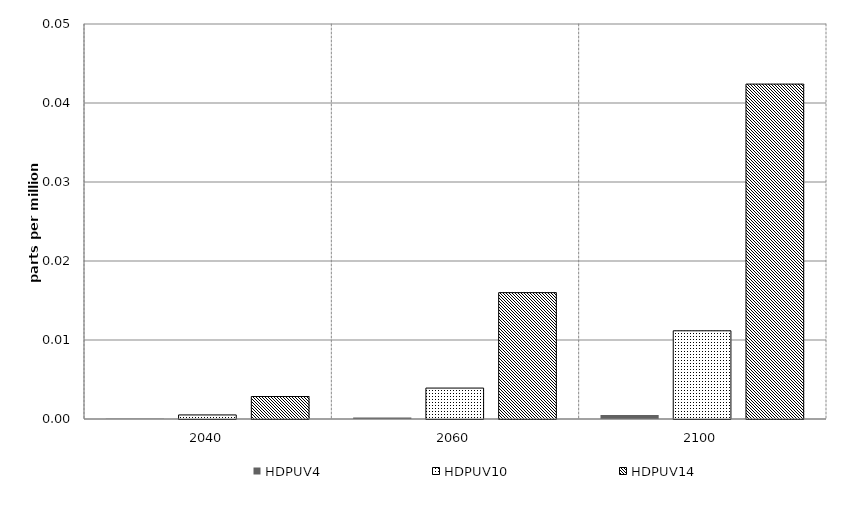
| Category | HDPUV4 | HDPUV10 | HDPUV14 | Alt 5 | Alt 6 | Alt 7 | Alt 8 | Alt 10 |
|---|---|---|---|---|---|---|---|---|
| 2040.0 | 0 | 0.001 | 0.003 |  |  |  |  |  |
| 2060.0 | 0 | 0.004 | 0.016 |  |  |  |  |  |
| 2100.0 | 0.001 | 0.011 | 0.042 |  |  |  |  |  |